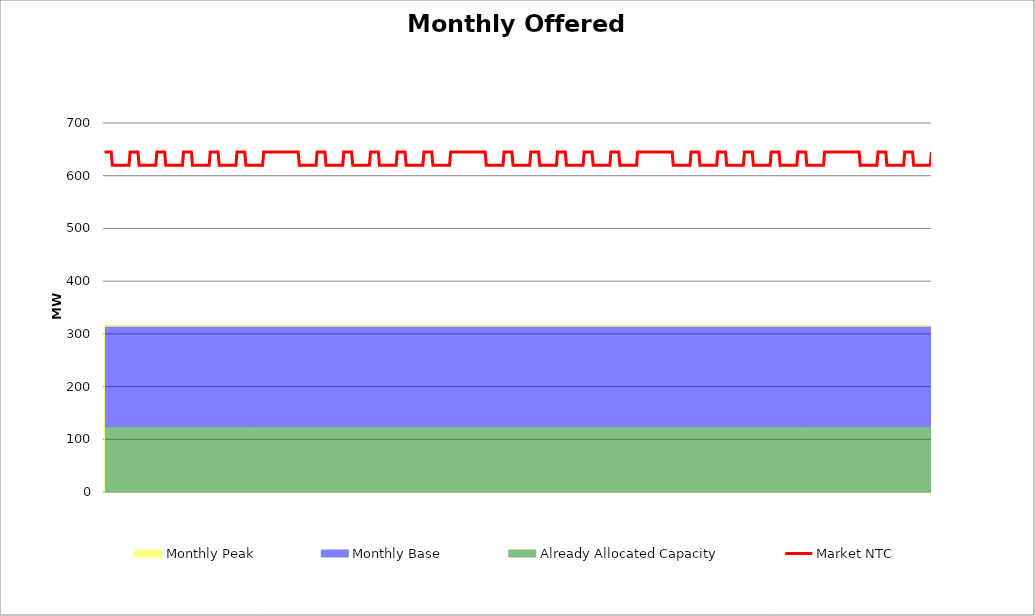
| Category | Market NTC |
|---|---|
| 0 | 645 |
| 1 | 645 |
| 2 | 645 |
| 3 | 645 |
| 4 | 645 |
| 5 | 645 |
| 6 | 645 |
| 7 | 620 |
| 8 | 620 |
| 9 | 620 |
| 10 | 620 |
| 11 | 620 |
| 12 | 620 |
| 13 | 620 |
| 14 | 620 |
| 15 | 620 |
| 16 | 620 |
| 17 | 620 |
| 18 | 620 |
| 19 | 620 |
| 20 | 620 |
| 21 | 620 |
| 22 | 620 |
| 23 | 645 |
| 24 | 645 |
| 25 | 645 |
| 26 | 645 |
| 27 | 645 |
| 28 | 645 |
| 29 | 645 |
| 30 | 645 |
| 31 | 620 |
| 32 | 620 |
| 33 | 620 |
| 34 | 620 |
| 35 | 620 |
| 36 | 620 |
| 37 | 620 |
| 38 | 620 |
| 39 | 620 |
| 40 | 620 |
| 41 | 620 |
| 42 | 620 |
| 43 | 620 |
| 44 | 620 |
| 45 | 620 |
| 46 | 620 |
| 47 | 645 |
| 48 | 645 |
| 49 | 645 |
| 50 | 645 |
| 51 | 645 |
| 52 | 645 |
| 53 | 645 |
| 54 | 645 |
| 55 | 620 |
| 56 | 620 |
| 57 | 620 |
| 58 | 620 |
| 59 | 620 |
| 60 | 620 |
| 61 | 620 |
| 62 | 620 |
| 63 | 620 |
| 64 | 620 |
| 65 | 620 |
| 66 | 620 |
| 67 | 620 |
| 68 | 620 |
| 69 | 620 |
| 70 | 620 |
| 71 | 645 |
| 72 | 645 |
| 73 | 645 |
| 74 | 645 |
| 75 | 645 |
| 76 | 645 |
| 77 | 645 |
| 78 | 645 |
| 79 | 620 |
| 80 | 620 |
| 81 | 620 |
| 82 | 620 |
| 83 | 620 |
| 84 | 620 |
| 85 | 620 |
| 86 | 620 |
| 87 | 620 |
| 88 | 620 |
| 89 | 620 |
| 90 | 620 |
| 91 | 620 |
| 92 | 620 |
| 93 | 620 |
| 94 | 620 |
| 95 | 645 |
| 96 | 645 |
| 97 | 645 |
| 98 | 645 |
| 99 | 645 |
| 100 | 645 |
| 101 | 645 |
| 102 | 645 |
| 103 | 620 |
| 104 | 620 |
| 105 | 620 |
| 106 | 620 |
| 107 | 620 |
| 108 | 620 |
| 109 | 620 |
| 110 | 620 |
| 111 | 620 |
| 112 | 620 |
| 113 | 620 |
| 114 | 620 |
| 115 | 620 |
| 116 | 620 |
| 117 | 620 |
| 118 | 620 |
| 119 | 645 |
| 120 | 645 |
| 121 | 645 |
| 122 | 645 |
| 123 | 645 |
| 124 | 645 |
| 125 | 645 |
| 126 | 645 |
| 127 | 620 |
| 128 | 620 |
| 129 | 620 |
| 130 | 620 |
| 131 | 620 |
| 132 | 620 |
| 133 | 620 |
| 134 | 620 |
| 135 | 620 |
| 136 | 620 |
| 137 | 620 |
| 138 | 620 |
| 139 | 620 |
| 140 | 620 |
| 141 | 620 |
| 142 | 620 |
| 143 | 645 |
| 144 | 645 |
| 145 | 645 |
| 146 | 645 |
| 147 | 645 |
| 148 | 645 |
| 149 | 645 |
| 150 | 645 |
| 151 | 645 |
| 152 | 645 |
| 153 | 645 |
| 154 | 645 |
| 155 | 645 |
| 156 | 645 |
| 157 | 645 |
| 158 | 645 |
| 159 | 645 |
| 160 | 645 |
| 161 | 645 |
| 162 | 645 |
| 163 | 645 |
| 164 | 645 |
| 165 | 645 |
| 166 | 645 |
| 167 | 645 |
| 168 | 645 |
| 169 | 645 |
| 170 | 645 |
| 171 | 645 |
| 172 | 645 |
| 173 | 645 |
| 174 | 645 |
| 175 | 620 |
| 176 | 620 |
| 177 | 620 |
| 178 | 620 |
| 179 | 620 |
| 180 | 620 |
| 181 | 620 |
| 182 | 620 |
| 183 | 620 |
| 184 | 620 |
| 185 | 620 |
| 186 | 620 |
| 187 | 620 |
| 188 | 620 |
| 189 | 620 |
| 190 | 620 |
| 191 | 645 |
| 192 | 645 |
| 193 | 645 |
| 194 | 645 |
| 195 | 645 |
| 196 | 645 |
| 197 | 645 |
| 198 | 645 |
| 199 | 620 |
| 200 | 620 |
| 201 | 620 |
| 202 | 620 |
| 203 | 620 |
| 204 | 620 |
| 205 | 620 |
| 206 | 620 |
| 207 | 620 |
| 208 | 620 |
| 209 | 620 |
| 210 | 620 |
| 211 | 620 |
| 212 | 620 |
| 213 | 620 |
| 214 | 620 |
| 215 | 645 |
| 216 | 645 |
| 217 | 645 |
| 218 | 645 |
| 219 | 645 |
| 220 | 645 |
| 221 | 645 |
| 222 | 645 |
| 223 | 620 |
| 224 | 620 |
| 225 | 620 |
| 226 | 620 |
| 227 | 620 |
| 228 | 620 |
| 229 | 620 |
| 230 | 620 |
| 231 | 620 |
| 232 | 620 |
| 233 | 620 |
| 234 | 620 |
| 235 | 620 |
| 236 | 620 |
| 237 | 620 |
| 238 | 620 |
| 239 | 645 |
| 240 | 645 |
| 241 | 645 |
| 242 | 645 |
| 243 | 645 |
| 244 | 645 |
| 245 | 645 |
| 246 | 645 |
| 247 | 620 |
| 248 | 620 |
| 249 | 620 |
| 250 | 620 |
| 251 | 620 |
| 252 | 620 |
| 253 | 620 |
| 254 | 620 |
| 255 | 620 |
| 256 | 620 |
| 257 | 620 |
| 258 | 620 |
| 259 | 620 |
| 260 | 620 |
| 261 | 620 |
| 262 | 620 |
| 263 | 645 |
| 264 | 645 |
| 265 | 645 |
| 266 | 645 |
| 267 | 645 |
| 268 | 645 |
| 269 | 645 |
| 270 | 645 |
| 271 | 620 |
| 272 | 620 |
| 273 | 620 |
| 274 | 620 |
| 275 | 620 |
| 276 | 620 |
| 277 | 620 |
| 278 | 620 |
| 279 | 620 |
| 280 | 620 |
| 281 | 620 |
| 282 | 620 |
| 283 | 620 |
| 284 | 620 |
| 285 | 620 |
| 286 | 620 |
| 287 | 645 |
| 288 | 645 |
| 289 | 645 |
| 290 | 645 |
| 291 | 645 |
| 292 | 645 |
| 293 | 645 |
| 294 | 645 |
| 295 | 620 |
| 296 | 620 |
| 297 | 620 |
| 298 | 620 |
| 299 | 620 |
| 300 | 620 |
| 301 | 620 |
| 302 | 620 |
| 303 | 620 |
| 304 | 620 |
| 305 | 620 |
| 306 | 620 |
| 307 | 620 |
| 308 | 620 |
| 309 | 620 |
| 310 | 620 |
| 311 | 645 |
| 312 | 645 |
| 313 | 645 |
| 314 | 645 |
| 315 | 645 |
| 316 | 645 |
| 317 | 645 |
| 318 | 645 |
| 319 | 645 |
| 320 | 645 |
| 321 | 645 |
| 322 | 645 |
| 323 | 645 |
| 324 | 645 |
| 325 | 645 |
| 326 | 645 |
| 327 | 645 |
| 328 | 645 |
| 329 | 645 |
| 330 | 645 |
| 331 | 645 |
| 332 | 645 |
| 333 | 645 |
| 334 | 645 |
| 335 | 645 |
| 336 | 645 |
| 337 | 645 |
| 338 | 645 |
| 339 | 645 |
| 340 | 645 |
| 341 | 645 |
| 342 | 645 |
| 343 | 620 |
| 344 | 620 |
| 345 | 620 |
| 346 | 620 |
| 347 | 620 |
| 348 | 620 |
| 349 | 620 |
| 350 | 620 |
| 351 | 620 |
| 352 | 620 |
| 353 | 620 |
| 354 | 620 |
| 355 | 620 |
| 356 | 620 |
| 357 | 620 |
| 358 | 620 |
| 359 | 645 |
| 360 | 645 |
| 361 | 645 |
| 362 | 645 |
| 363 | 645 |
| 364 | 645 |
| 365 | 645 |
| 366 | 645 |
| 367 | 620 |
| 368 | 620 |
| 369 | 620 |
| 370 | 620 |
| 371 | 620 |
| 372 | 620 |
| 373 | 620 |
| 374 | 620 |
| 375 | 620 |
| 376 | 620 |
| 377 | 620 |
| 378 | 620 |
| 379 | 620 |
| 380 | 620 |
| 381 | 620 |
| 382 | 620 |
| 383 | 645 |
| 384 | 645 |
| 385 | 645 |
| 386 | 645 |
| 387 | 645 |
| 388 | 645 |
| 389 | 645 |
| 390 | 645 |
| 391 | 620 |
| 392 | 620 |
| 393 | 620 |
| 394 | 620 |
| 395 | 620 |
| 396 | 620 |
| 397 | 620 |
| 398 | 620 |
| 399 | 620 |
| 400 | 620 |
| 401 | 620 |
| 402 | 620 |
| 403 | 620 |
| 404 | 620 |
| 405 | 620 |
| 406 | 620 |
| 407 | 645 |
| 408 | 645 |
| 409 | 645 |
| 410 | 645 |
| 411 | 645 |
| 412 | 645 |
| 413 | 645 |
| 414 | 645 |
| 415 | 620 |
| 416 | 620 |
| 417 | 620 |
| 418 | 620 |
| 419 | 620 |
| 420 | 620 |
| 421 | 620 |
| 422 | 620 |
| 423 | 620 |
| 424 | 620 |
| 425 | 620 |
| 426 | 620 |
| 427 | 620 |
| 428 | 620 |
| 429 | 620 |
| 430 | 620 |
| 431 | 645 |
| 432 | 645 |
| 433 | 645 |
| 434 | 645 |
| 435 | 645 |
| 436 | 645 |
| 437 | 645 |
| 438 | 645 |
| 439 | 620 |
| 440 | 620 |
| 441 | 620 |
| 442 | 620 |
| 443 | 620 |
| 444 | 620 |
| 445 | 620 |
| 446 | 620 |
| 447 | 620 |
| 448 | 620 |
| 449 | 620 |
| 450 | 620 |
| 451 | 620 |
| 452 | 620 |
| 453 | 620 |
| 454 | 620 |
| 455 | 645 |
| 456 | 645 |
| 457 | 645 |
| 458 | 645 |
| 459 | 645 |
| 460 | 645 |
| 461 | 645 |
| 462 | 645 |
| 463 | 620 |
| 464 | 620 |
| 465 | 620 |
| 466 | 620 |
| 467 | 620 |
| 468 | 620 |
| 469 | 620 |
| 470 | 620 |
| 471 | 620 |
| 472 | 620 |
| 473 | 620 |
| 474 | 620 |
| 475 | 620 |
| 476 | 620 |
| 477 | 620 |
| 478 | 620 |
| 479 | 645 |
| 480 | 645 |
| 481 | 645 |
| 482 | 645 |
| 483 | 645 |
| 484 | 645 |
| 485 | 645 |
| 486 | 645 |
| 487 | 645 |
| 488 | 645 |
| 489 | 645 |
| 490 | 645 |
| 491 | 645 |
| 492 | 645 |
| 493 | 645 |
| 494 | 645 |
| 495 | 645 |
| 496 | 645 |
| 497 | 645 |
| 498 | 645 |
| 499 | 645 |
| 500 | 645 |
| 501 | 645 |
| 502 | 645 |
| 503 | 645 |
| 504 | 645 |
| 505 | 645 |
| 506 | 645 |
| 507 | 645 |
| 508 | 645 |
| 509 | 645 |
| 510 | 645 |
| 511 | 620 |
| 512 | 620 |
| 513 | 620 |
| 514 | 620 |
| 515 | 620 |
| 516 | 620 |
| 517 | 620 |
| 518 | 620 |
| 519 | 620 |
| 520 | 620 |
| 521 | 620 |
| 522 | 620 |
| 523 | 620 |
| 524 | 620 |
| 525 | 620 |
| 526 | 620 |
| 527 | 645 |
| 528 | 645 |
| 529 | 645 |
| 530 | 645 |
| 531 | 645 |
| 532 | 645 |
| 533 | 645 |
| 534 | 645 |
| 535 | 620 |
| 536 | 620 |
| 537 | 620 |
| 538 | 620 |
| 539 | 620 |
| 540 | 620 |
| 541 | 620 |
| 542 | 620 |
| 543 | 620 |
| 544 | 620 |
| 545 | 620 |
| 546 | 620 |
| 547 | 620 |
| 548 | 620 |
| 549 | 620 |
| 550 | 620 |
| 551 | 645 |
| 552 | 645 |
| 553 | 645 |
| 554 | 645 |
| 555 | 645 |
| 556 | 645 |
| 557 | 645 |
| 558 | 645 |
| 559 | 620 |
| 560 | 620 |
| 561 | 620 |
| 562 | 620 |
| 563 | 620 |
| 564 | 620 |
| 565 | 620 |
| 566 | 620 |
| 567 | 620 |
| 568 | 620 |
| 569 | 620 |
| 570 | 620 |
| 571 | 620 |
| 572 | 620 |
| 573 | 620 |
| 574 | 620 |
| 575 | 645 |
| 576 | 645 |
| 577 | 645 |
| 578 | 645 |
| 579 | 645 |
| 580 | 645 |
| 581 | 645 |
| 582 | 645 |
| 583 | 620 |
| 584 | 620 |
| 585 | 620 |
| 586 | 620 |
| 587 | 620 |
| 588 | 620 |
| 589 | 620 |
| 590 | 620 |
| 591 | 620 |
| 592 | 620 |
| 593 | 620 |
| 594 | 620 |
| 595 | 620 |
| 596 | 620 |
| 597 | 620 |
| 598 | 620 |
| 599 | 645 |
| 600 | 645 |
| 601 | 645 |
| 602 | 645 |
| 603 | 645 |
| 604 | 645 |
| 605 | 645 |
| 606 | 645 |
| 607 | 620 |
| 608 | 620 |
| 609 | 620 |
| 610 | 620 |
| 611 | 620 |
| 612 | 620 |
| 613 | 620 |
| 614 | 620 |
| 615 | 620 |
| 616 | 620 |
| 617 | 620 |
| 618 | 620 |
| 619 | 620 |
| 620 | 620 |
| 621 | 620 |
| 622 | 620 |
| 623 | 645 |
| 624 | 645 |
| 625 | 645 |
| 626 | 645 |
| 627 | 645 |
| 628 | 645 |
| 629 | 645 |
| 630 | 645 |
| 631 | 620 |
| 632 | 620 |
| 633 | 620 |
| 634 | 620 |
| 635 | 620 |
| 636 | 620 |
| 637 | 620 |
| 638 | 620 |
| 639 | 620 |
| 640 | 620 |
| 641 | 620 |
| 642 | 620 |
| 643 | 620 |
| 644 | 620 |
| 645 | 620 |
| 646 | 620 |
| 647 | 645 |
| 648 | 645 |
| 649 | 645 |
| 650 | 645 |
| 651 | 645 |
| 652 | 645 |
| 653 | 645 |
| 654 | 645 |
| 655 | 645 |
| 656 | 645 |
| 657 | 645 |
| 658 | 645 |
| 659 | 645 |
| 660 | 645 |
| 661 | 645 |
| 662 | 645 |
| 663 | 645 |
| 664 | 645 |
| 665 | 645 |
| 666 | 645 |
| 667 | 645 |
| 668 | 645 |
| 669 | 645 |
| 670 | 645 |
| 671 | 645 |
| 672 | 645 |
| 673 | 645 |
| 674 | 645 |
| 675 | 645 |
| 676 | 645 |
| 677 | 645 |
| 678 | 645 |
| 679 | 620 |
| 680 | 620 |
| 681 | 620 |
| 682 | 620 |
| 683 | 620 |
| 684 | 620 |
| 685 | 620 |
| 686 | 620 |
| 687 | 620 |
| 688 | 620 |
| 689 | 620 |
| 690 | 620 |
| 691 | 620 |
| 692 | 620 |
| 693 | 620 |
| 694 | 620 |
| 695 | 645 |
| 696 | 645 |
| 697 | 645 |
| 698 | 645 |
| 699 | 645 |
| 700 | 645 |
| 701 | 645 |
| 702 | 645 |
| 703 | 620 |
| 704 | 620 |
| 705 | 620 |
| 706 | 620 |
| 707 | 620 |
| 708 | 620 |
| 709 | 620 |
| 710 | 620 |
| 711 | 620 |
| 712 | 620 |
| 713 | 620 |
| 714 | 620 |
| 715 | 620 |
| 716 | 620 |
| 717 | 620 |
| 718 | 620 |
| 719 | 645 |
| 720 | 645 |
| 721 | 645 |
| 722 | 645 |
| 723 | 645 |
| 724 | 645 |
| 725 | 645 |
| 726 | 645 |
| 727 | 620 |
| 728 | 620 |
| 729 | 620 |
| 730 | 620 |
| 731 | 620 |
| 732 | 620 |
| 733 | 620 |
| 734 | 620 |
| 735 | 620 |
| 736 | 620 |
| 737 | 620 |
| 738 | 620 |
| 739 | 620 |
| 740 | 620 |
| 741 | 620 |
| 742 | 620 |
| 743 | 645 |